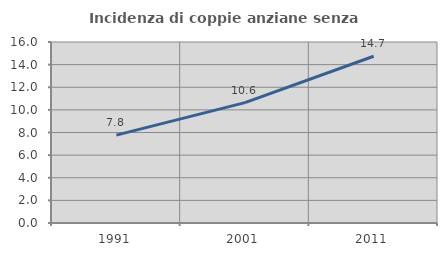
| Category | Incidenza di coppie anziane senza figli  |
|---|---|
| 1991.0 | 7.767 |
| 2001.0 | 10.642 |
| 2011.0 | 14.743 |